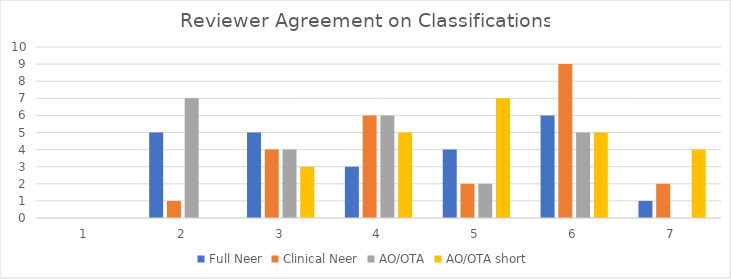
| Category | Full Neer | Clinical Neer | AO/OTA | AO/OTA short |
|---|---|---|---|---|
| 4 or more | 14 | 19 | 13 | 21 |
| 5 or more | 11 | 13 | 7 | 16 |
| 6 or more | 7 | 11 | 5 | 9 |